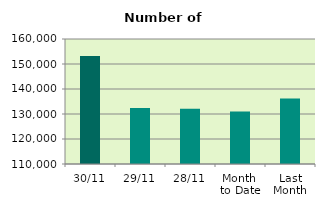
| Category | Series 0 |
|---|---|
| 30/11 | 153152 |
| 29/11 | 132450 |
| 28/11 | 132078 |
| Month 
to Date | 131016.636 |
| Last
Month | 136171.238 |